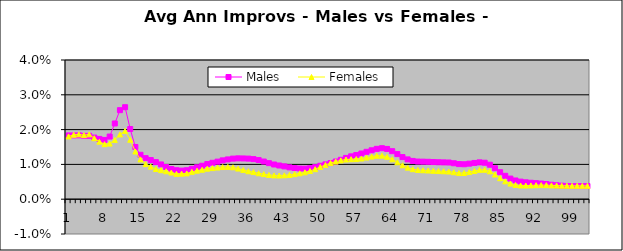
| Category | Males | Females |
|---|---|---|
| 0 | 0.018 | 0.018 |
| 1 | 0.018 | 0.019 |
| 2 | 0.018 | 0.019 |
| 3 | 0.018 | 0.018 |
| 4 | 0.018 | 0.019 |
| 5 | 0.018 | 0.018 |
| 6 | 0.017 | 0.017 |
| 7 | 0.017 | 0.016 |
| 8 | 0.018 | 0.016 |
| 9 | 0.022 | 0.017 |
| 10 | 0.026 | 0.019 |
| 11 | 0.026 | 0.02 |
| 12 | 0.02 | 0.017 |
| 13 | 0.015 | 0.014 |
| 14 | 0.013 | 0.011 |
| 15 | 0.012 | 0.01 |
| 16 | 0.011 | 0.009 |
| 17 | 0.011 | 0.009 |
| 18 | 0.01 | 0.008 |
| 19 | 0.009 | 0.008 |
| 20 | 0.009 | 0.008 |
| 21 | 0.008 | 0.007 |
| 22 | 0.008 | 0.007 |
| 23 | 0.008 | 0.007 |
| 24 | 0.009 | 0.008 |
| 25 | 0.009 | 0.008 |
| 26 | 0.01 | 0.008 |
| 27 | 0.01 | 0.009 |
| 28 | 0.01 | 0.009 |
| 29 | 0.011 | 0.009 |
| 30 | 0.011 | 0.009 |
| 31 | 0.011 | 0.009 |
| 32 | 0.012 | 0.009 |
| 33 | 0.012 | 0.009 |
| 34 | 0.012 | 0.008 |
| 35 | 0.012 | 0.008 |
| 36 | 0.012 | 0.008 |
| 37 | 0.011 | 0.007 |
| 38 | 0.011 | 0.007 |
| 39 | 0.01 | 0.007 |
| 40 | 0.01 | 0.007 |
| 41 | 0.01 | 0.007 |
| 42 | 0.009 | 0.007 |
| 43 | 0.009 | 0.007 |
| 44 | 0.009 | 0.007 |
| 45 | 0.009 | 0.007 |
| 46 | 0.009 | 0.008 |
| 47 | 0.009 | 0.008 |
| 48 | 0.009 | 0.009 |
| 49 | 0.01 | 0.009 |
| 50 | 0.01 | 0.01 |
| 51 | 0.01 | 0.01 |
| 52 | 0.011 | 0.011 |
| 53 | 0.011 | 0.011 |
| 54 | 0.012 | 0.011 |
| 55 | 0.012 | 0.011 |
| 56 | 0.013 | 0.012 |
| 57 | 0.013 | 0.012 |
| 58 | 0.014 | 0.012 |
| 59 | 0.014 | 0.012 |
| 60 | 0.014 | 0.012 |
| 61 | 0.015 | 0.013 |
| 62 | 0.014 | 0.012 |
| 63 | 0.014 | 0.011 |
| 64 | 0.013 | 0.011 |
| 65 | 0.012 | 0.01 |
| 66 | 0.011 | 0.009 |
| 67 | 0.011 | 0.009 |
| 68 | 0.011 | 0.008 |
| 69 | 0.011 | 0.008 |
| 70 | 0.011 | 0.008 |
| 71 | 0.011 | 0.008 |
| 72 | 0.011 | 0.008 |
| 73 | 0.011 | 0.008 |
| 74 | 0.011 | 0.008 |
| 75 | 0.01 | 0.008 |
| 76 | 0.01 | 0.008 |
| 77 | 0.01 | 0.008 |
| 78 | 0.01 | 0.008 |
| 79 | 0.01 | 0.008 |
| 80 | 0.011 | 0.008 |
| 81 | 0.01 | 0.008 |
| 82 | 0.01 | 0.008 |
| 83 | 0.009 | 0.007 |
| 84 | 0.008 | 0.006 |
| 85 | 0.007 | 0.005 |
| 86 | 0.006 | 0.004 |
| 87 | 0.005 | 0.004 |
| 88 | 0.005 | 0.004 |
| 89 | 0.005 | 0.004 |
| 90 | 0.005 | 0.004 |
| 91 | 0.005 | 0.004 |
| 92 | 0.004 | 0.004 |
| 93 | 0.004 | 0.004 |
| 94 | 0.004 | 0.004 |
| 95 | 0.004 | 0.004 |
| 96 | 0.004 | 0.004 |
| 97 | 0.004 | 0.004 |
| 98 | 0.004 | 0.004 |
| 99 | 0.004 | 0.004 |
| 100 | 0.004 | 0.004 |
| 101 | 0.004 | 0.004 |